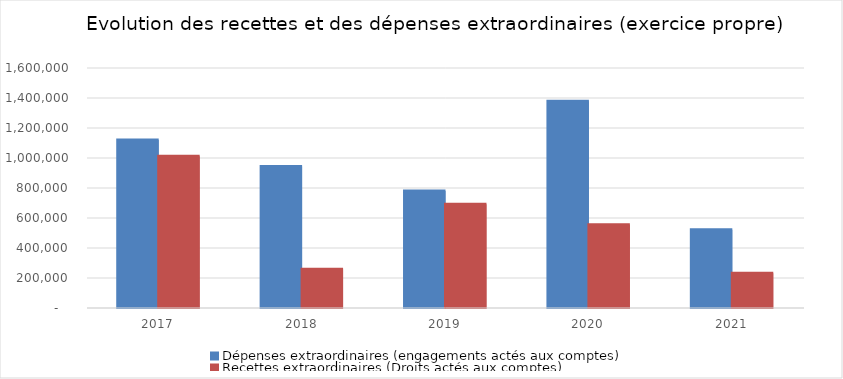
| Category | Dépenses extraordinaires (engagements actés aux comptes) | Recettes extraordinaires (Droits actés aux comptes) |
|---|---|---|
| 2017.0 | 1119270.73 | 1012038.15 |
| 2018.0 | 942505.8 | 257676.58 |
| 2019.0 | 779247.36 | 691005.25 |
| 2020.0 | 1379060.62 | 555060.95 |
| 2021.0 | 522094.46 | 232119.55 |